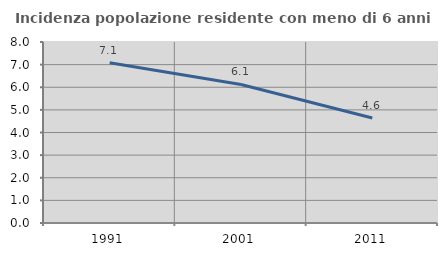
| Category | Incidenza popolazione residente con meno di 6 anni |
|---|---|
| 1991.0 | 7.081 |
| 2001.0 | 6.122 |
| 2011.0 | 4.639 |